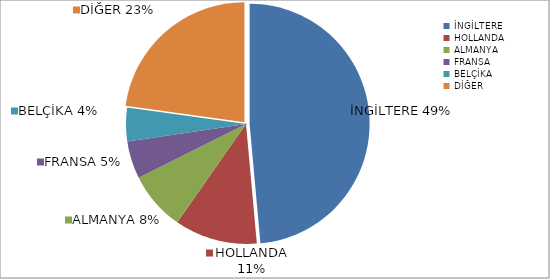
| Category | Series 0 |
|---|---|
| İNGİLTERE | 54713 |
| HOLLANDA | 12562 |
| ALMANYA | 8914 |
| FRANSA | 5705 |
| BELÇİKA | 5089 |
| DİĞER | 25687 |